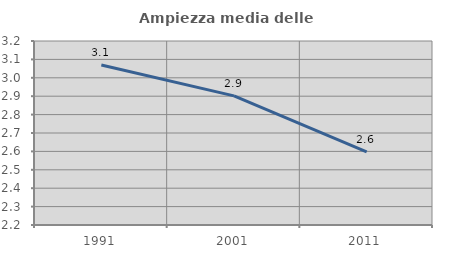
| Category | Ampiezza media delle famiglie |
|---|---|
| 1991.0 | 3.069 |
| 2001.0 | 2.902 |
| 2011.0 | 2.598 |